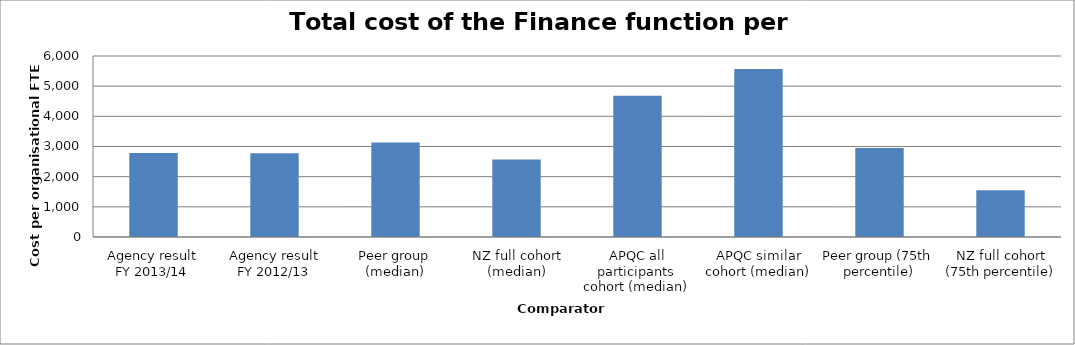
| Category | Result |
|---|---|
| Agency result
FY 2013/14 | 2784.364 |
| Agency result
FY 2012/13 | 2777.349 |
| Peer group (median) | 3128.752 |
| NZ full cohort (median) | 2569.26 |
| APQC all participants cohort (median) | 4679 |
| APQC similar cohort (median) | 5571 |
| Peer group (75th percentile) | 2951 |
| NZ full cohort (75th percentile) | 1551.346 |